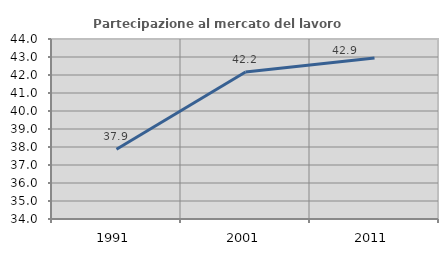
| Category | Partecipazione al mercato del lavoro  femminile |
|---|---|
| 1991.0 | 37.879 |
| 2001.0 | 42.169 |
| 2011.0 | 42.946 |